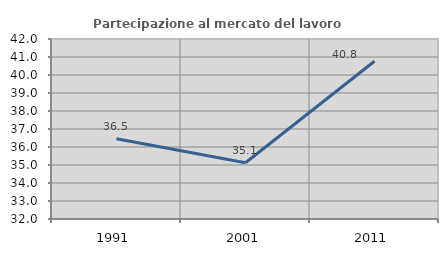
| Category | Partecipazione al mercato del lavoro  femminile |
|---|---|
| 1991.0 | 36.462 |
| 2001.0 | 35.124 |
| 2011.0 | 40.763 |